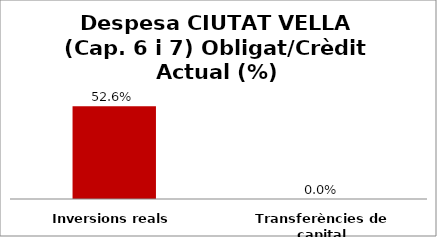
| Category | Series 0 |
|---|---|
| Inversions reals | 0.526 |
| Transferències de capital | 0 |